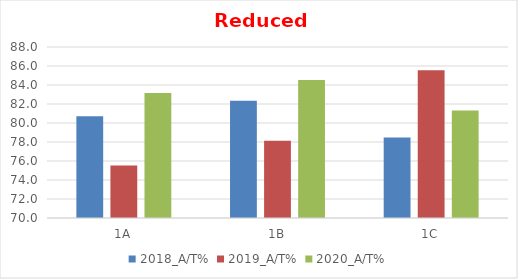
| Category | 2018_A/T% | 2019_A/T% | 2020_A/T% |
|---|---|---|---|
| 1A | 80.723 | 75.532 | 83.158 |
| 1B | 82.353 | 78.125 | 84.536 |
| 1C | 78.481 | 85.556 | 81.319 |